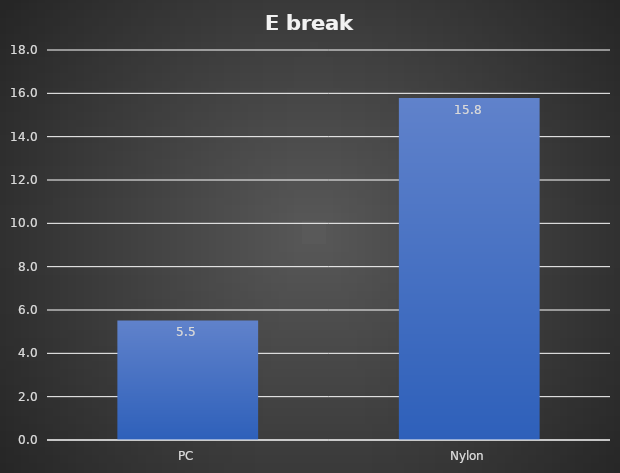
| Category | kJ/m² |
|---|---|
| PC | 5.518 |
| Nylon | 15.788 |